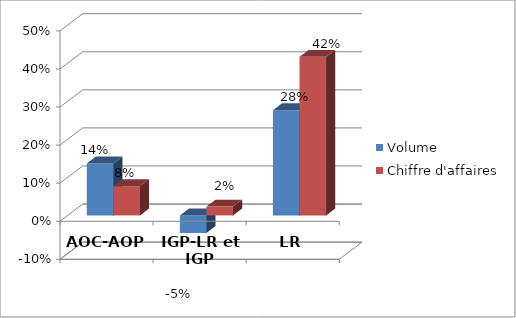
| Category | Volume | Chiffre d'affaires |
|---|---|---|
| AOC-AOP | 0.137 | 0.077 |
| IGP-LR et IGP | -0.046 | 0.023 |
| LR | 0.276 | 0.417 |